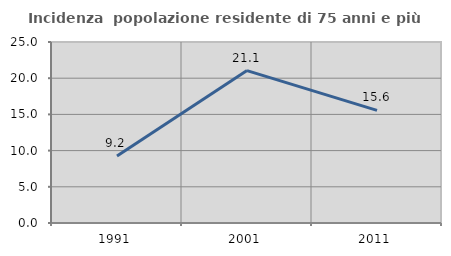
| Category | Incidenza  popolazione residente di 75 anni e più |
|---|---|
| 1991.0 | 9.244 |
| 2001.0 | 21.053 |
| 2011.0 | 15.556 |